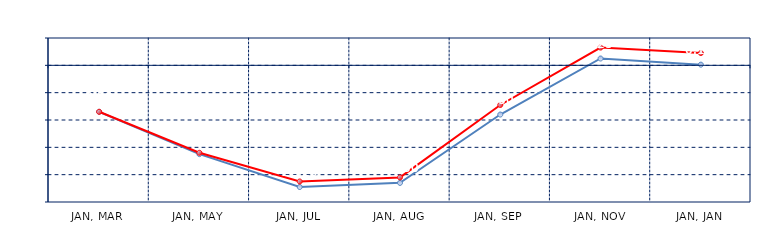
| Category | Series 0 | Series 1 |
|---|---|---|
| JAN, MAR | -8.5 | -8.5 |
| JAN, MAY | -16.25 | -16 |
| JAN, JUL | -22.25 | -21.25 |
| JAN, AUG | -21.5 | -20.5 |
| JAN, SEP | -9 | -7.25 |
| JAN, NOV | 1.25 | 3.25 |
| JAN, JAN | 0.125 | 2.25 |